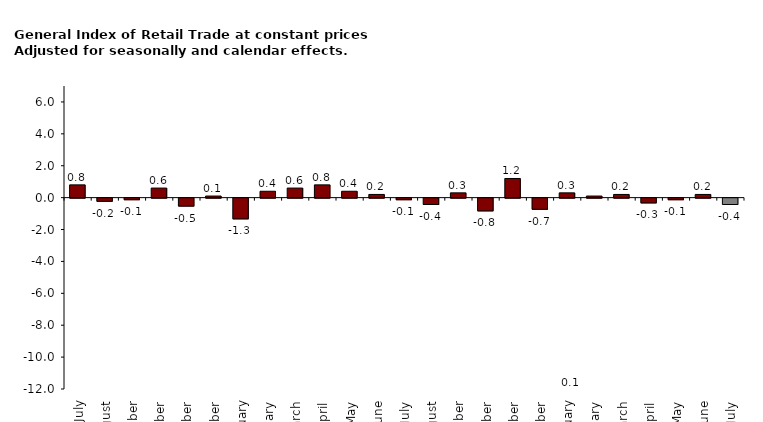
| Category | Series 3 |
|---|---|
| 2016 July | 0.8 |
|  August | -0.2 |
|  September | -0.1 |
|  October | 0.6 |
|  November | -0.5 |
|  December | 0.1 |
| 2017 January | -1.3 |
|  February | 0.4 |
|  March | 0.6 |
|  April | 0.8 |
|  May | 0.4 |
|  June | 0.2 |
|  July | -0.1 |
|  August | -0.4 |
|  September | 0.3 |
|  October | -0.8 |
|  November | 1.2 |
|  December | -0.7 |
| 2018 January | 0.3 |
|  February | 0.1 |
|  March | 0.2 |
|  April | -0.3 |
|  May | -0.1 |
|  June | 0.2 |
|  July | -0.4 |